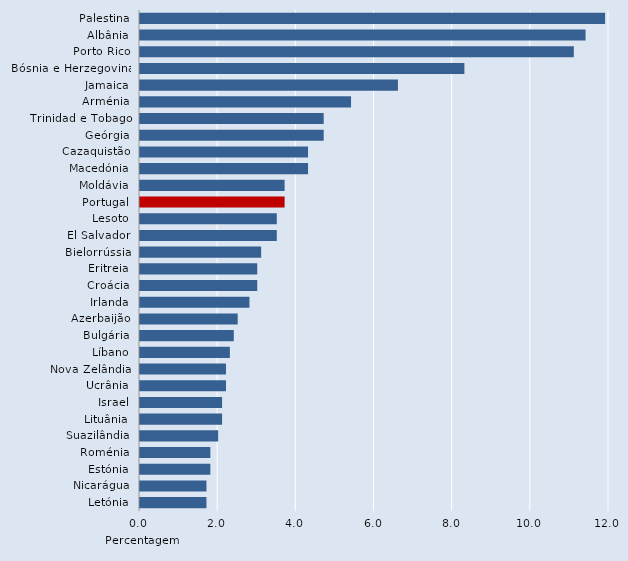
| Category | Series 0 |
|---|---|
| Palestina | 11.9 |
| Albânia | 11.4 |
| Porto Rico | 11.1 |
| Bósnia e Herzegovina | 8.3 |
| Jamaica | 6.6 |
| Arménia | 5.4 |
| Trinidad e Tobago | 4.7 |
| Geórgia | 4.7 |
| Cazaquistão | 4.3 |
| Macedónia | 4.3 |
| Moldávia | 3.7 |
| Portugal | 3.7 |
| Lesoto | 3.5 |
| El Salvador | 3.5 |
| Bielorrússia | 3.1 |
| Eritreia | 3 |
| Croácia | 3 |
| Irlanda | 2.8 |
| Azerbaijão | 2.5 |
| Bulgária | 2.4 |
| Líbano | 2.3 |
| Nova Zelândia | 2.2 |
| Ucrânia | 2.2 |
| Israel | 2.1 |
| Lituânia | 2.1 |
| Suazilândia | 2 |
| Roménia | 1.8 |
| Estónia | 1.8 |
| Nicarágua | 1.7 |
| Letónia | 1.7 |